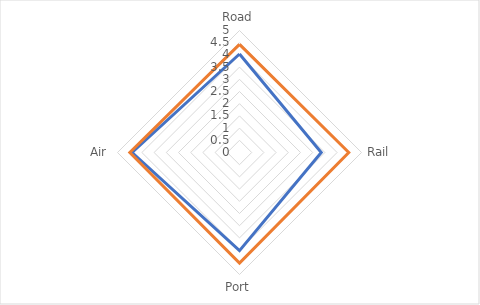
| Category | Global Average | India |
|---|---|---|
| Road | 4.037 | 4.43 |
| Rail | 3.351 | 4.478 |
| Port | 4.022 | 4.531 |
| Air | 4.401 | 4.495 |